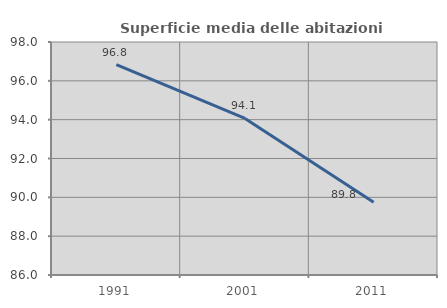
| Category | Superficie media delle abitazioni occupate |
|---|---|
| 1991.0 | 96.833 |
| 2001.0 | 94.063 |
| 2011.0 | 89.751 |